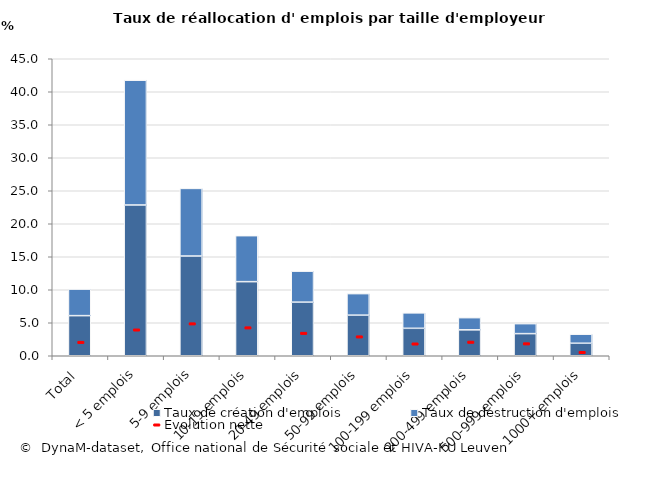
| Category | Taux de création d'emplois | Taux de destruction d'emplois |
|---|---|---|
| Total | 6.077 | 4.021 |
| < 5 emplois | 22.843 | 18.908 |
| 5-9 emplois | 15.109 | 10.247 |
| 10-19 emplois | 11.227 | 6.968 |
| 20-49 emplois | 8.123 | 4.696 |
| 50-99 emplois | 6.152 | 3.263 |
| 100-199 emplois | 4.158 | 2.342 |
| 200-499 emplois | 3.927 | 1.845 |
| 500-999 emplois | 3.353 | 1.514 |
| 1000+ emplois | 1.896 | 1.368 |